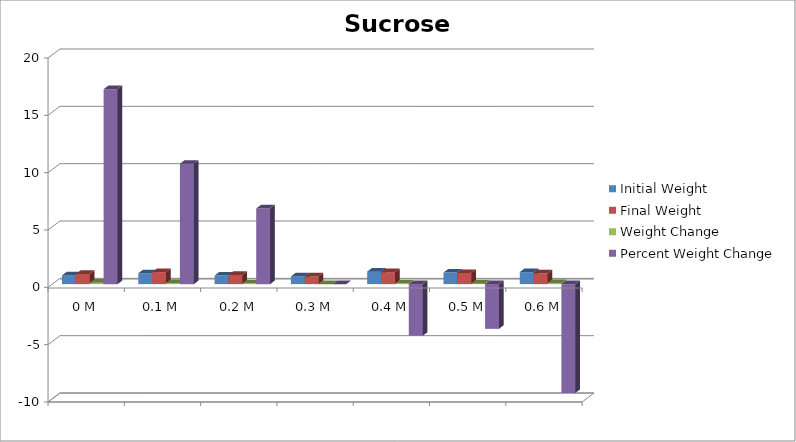
| Category | Initial Weight | Final Weight | Weight Change | Percent Weight Change |
|---|---|---|---|---|
| 0 M | 0.76 | 0.89 | 0.13 | 17 |
| 0.1 M | 0.95 | 1.05 | 0.1 | 10.5 |
| 0.2 M | 0.75 | 0.8 | 0.05 | 6.6 |
| 0.3 M | 0.67 | 0.67 | 0 | 0 |
| 0.4 M | 1.09 | 1.04 | 0.05 | -4.5 |
| 0.5 M | 1.01 | 0.97 | 0.04 | -3.9 |
| 0.6 M | 1.05 | 0.95 | 0.1 | -9.5 |